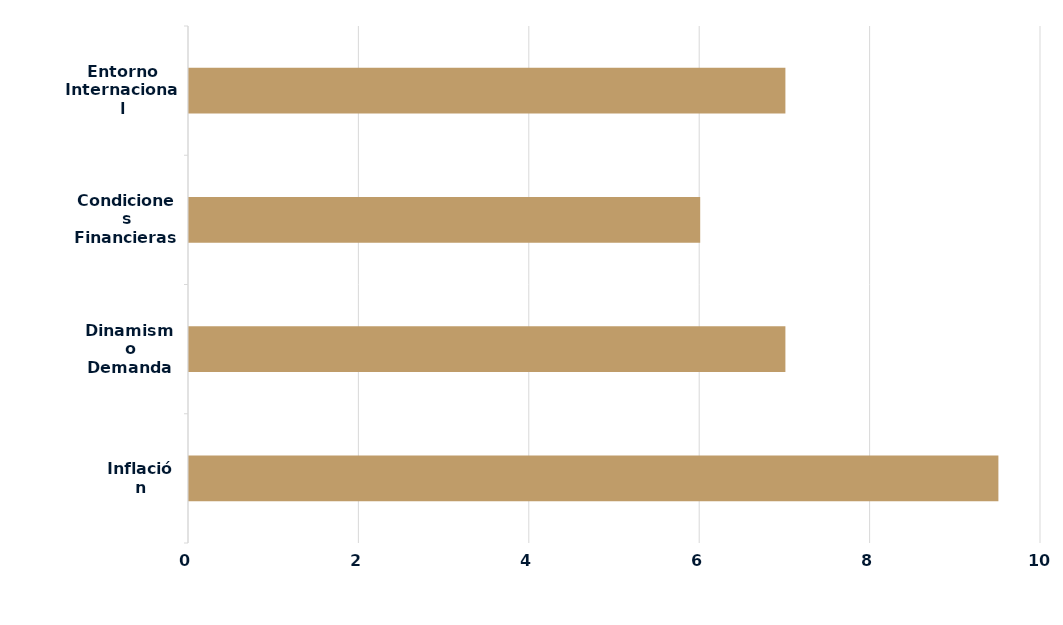
| Category | Series 0 |
|---|---|
| Inflación | 9.5 |
| Dinamismo Demanda | 7 |
| Condiciones Financieras Locales | 6 |
| Entorno Internacional | 7 |